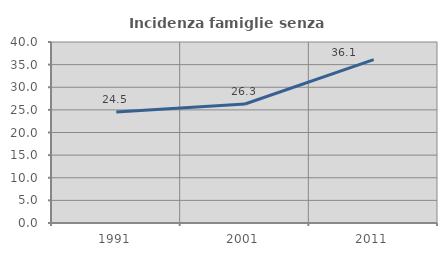
| Category | Incidenza famiglie senza nuclei |
|---|---|
| 1991.0 | 24.546 |
| 2001.0 | 26.294 |
| 2011.0 | 36.115 |